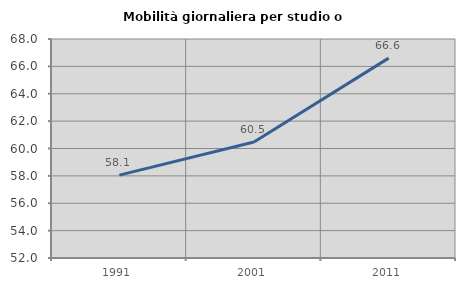
| Category | Mobilità giornaliera per studio o lavoro |
|---|---|
| 1991.0 | 58.053 |
| 2001.0 | 60.478 |
| 2011.0 | 66.602 |